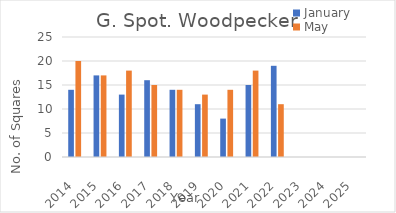
| Category | January | May |
|---|---|---|
| 2014.0 | 14 | 20 |
| 2015.0 | 17 | 17 |
| 2016.0 | 13 | 18 |
| 2017.0 | 16 | 15 |
| 2018.0 | 14 | 14 |
| 2019.0 | 11 | 13 |
| 2020.0 | 8 | 14 |
| 2021.0 | 15 | 18 |
| 2022.0 | 19 | 11 |
| 2023.0 | 0 | 0 |
| 2024.0 | 0 | 0 |
| 2025.0 | 0 | 0 |